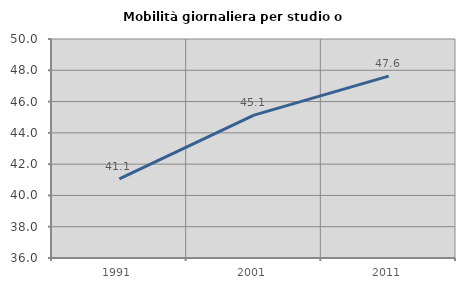
| Category | Mobilità giornaliera per studio o lavoro |
|---|---|
| 1991.0 | 41.065 |
| 2001.0 | 45.137 |
| 2011.0 | 47.624 |